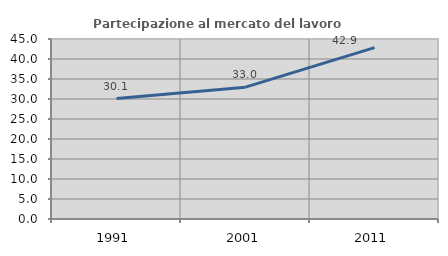
| Category | Partecipazione al mercato del lavoro  femminile |
|---|---|
| 1991.0 | 30.116 |
| 2001.0 | 32.963 |
| 2011.0 | 42.857 |